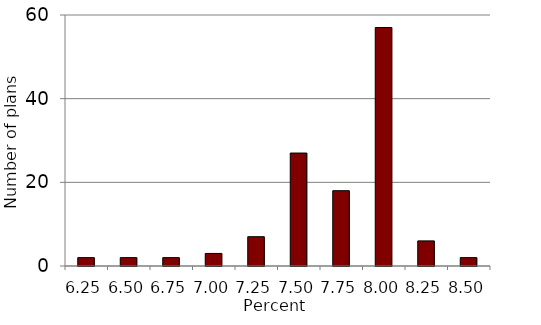
| Category | Series 1 |
|---|---|
| 6.25 | 2 |
| 6.5 | 2 |
| 6.75 | 2 |
| 7.0 | 3 |
| 7.25 | 7 |
| 7.5 | 27 |
| 7.75 | 18 |
| 8.0 | 57 |
| 8.25 | 6 |
| 8.5 | 2 |